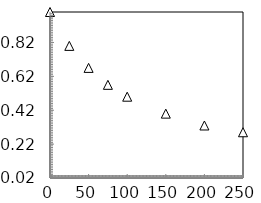
| Category | Series 2 |
|---|---|
| 0.0 | 1 |
| 25.0 | 0.8 |
| 50.0 | 0.67 |
| 75.0 | 0.57 |
| 100.0 | 0.5 |
| 150.0 | 0.4 |
| 200.0 | 0.33 |
| 250.0 | 0.29 |